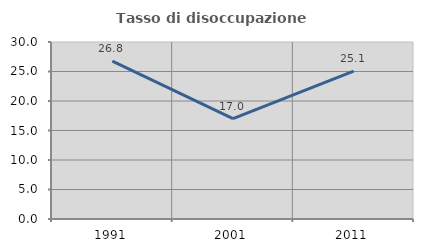
| Category | Tasso di disoccupazione giovanile  |
|---|---|
| 1991.0 | 26.754 |
| 2001.0 | 17.002 |
| 2011.0 | 25.059 |